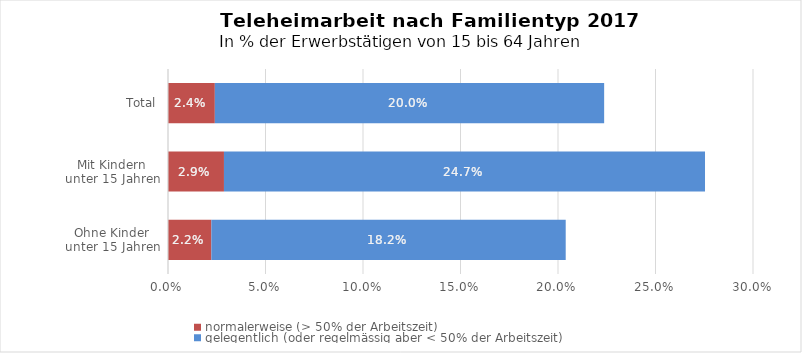
| Category | normalerweise (> 50% der Arbeitszeit) | gelegentlich (oder regelmässig aber < 50% der Arbeitszeit) |
|---|---|---|
| Ohne Kinder unter 15 Jahren | 0.022 | 0.182 |
| Mit Kindern unter 15 Jahren | 0.029 | 0.247 |
| Total | 0.024 | 0.2 |